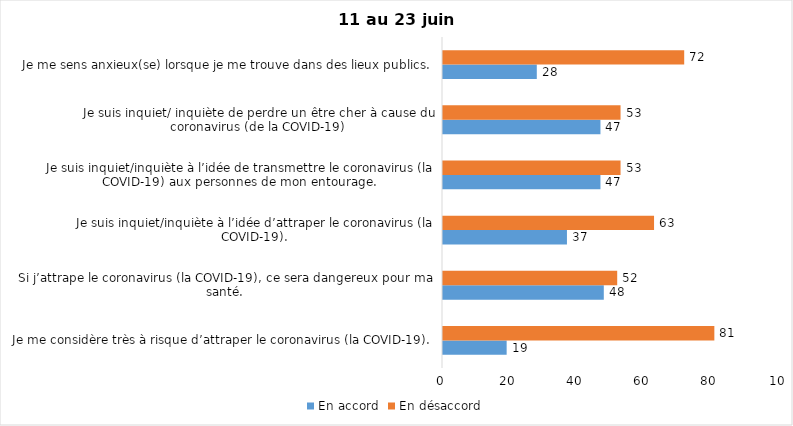
| Category | En accord | En désaccord |
|---|---|---|
| Je me considère très à risque d’attraper le coronavirus (la COVID-19). | 19 | 81 |
| Si j’attrape le coronavirus (la COVID-19), ce sera dangereux pour ma santé. | 48 | 52 |
| Je suis inquiet/inquiète à l’idée d’attraper le coronavirus (la COVID-19). | 37 | 63 |
| Je suis inquiet/inquiète à l’idée de transmettre le coronavirus (la COVID-19) aux personnes de mon entourage. | 47 | 53 |
| Je suis inquiet/ inquiète de perdre un être cher à cause du coronavirus (de la COVID-19) | 47 | 53 |
| Je me sens anxieux(se) lorsque je me trouve dans des lieux publics. | 28 | 72 |